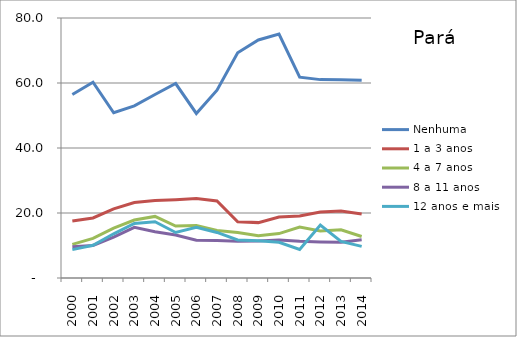
| Category | Nenhuma | 1 a 3 anos | 4 a 7 anos | 8 a 11 anos | 12 anos e mais |
|---|---|---|---|---|---|
| 2000.0 | 56.486 | 17.567 | 10.348 | 9.614 | 8.731 |
| 2001.0 | 60.239 | 18.481 | 12.165 | 10.01 | 10.083 |
| 2002.0 | 50.853 | 21.285 | 15.346 | 12.611 | 13.604 |
| 2003.0 | 52.957 | 23.242 | 17.846 | 15.607 | 16.767 |
| 2004.0 | 56.477 | 23.847 | 18.948 | 14.241 | 17.308 |
| 2005.0 | 59.838 | 24.106 | 15.968 | 13.221 | 14 |
| 2006.0 | 50.63 | 24.462 | 16.138 | 11.635 | 15.583 |
| 2007.0 | 57.779 | 23.721 | 14.639 | 11.561 | 14.016 |
| 2008.0 | 69.32 | 17.31 | 13.981 | 11.299 | 11.686 |
| 2009.0 | 73.248 | 17.04 | 13.002 | 11.396 | 11.482 |
| 2010.0 | 75.083 | 18.79 | 13.665 | 11.681 | 10.974 |
| 2011.0 | 61.781 | 19.069 | 15.678 | 11.31 | 8.772 |
| 2012.0 | 61.041 | 20.275 | 14.489 | 11.098 | 16.313 |
| 2013.0 | 61.026 | 20.634 | 14.814 | 10.968 | 11.269 |
| 2014.0 | 60.845 | 19.716 | 12.764 | 11.763 | 9.729 |